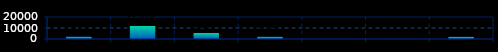
| Category | Series 0 |
|---|---|
|  Mar 15, Jun 15 | 2119 |
|  Jun 15, Sep 15 | 11865 |
|  Sep 15, Dec 15 | 5499 |
|  Dec 15, Mar 16 | 2058 |
|  Mar 16, Jun 16 | 23 |
|  Jun 16, Sep 16 | 57 |
|  Sep 16, Dec 16 | 1984 |